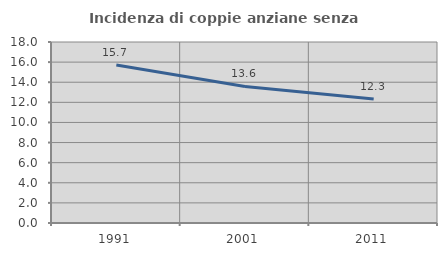
| Category | Incidenza di coppie anziane senza figli  |
|---|---|
| 1991.0 | 15.714 |
| 2001.0 | 13.58 |
| 2011.0 | 12.329 |